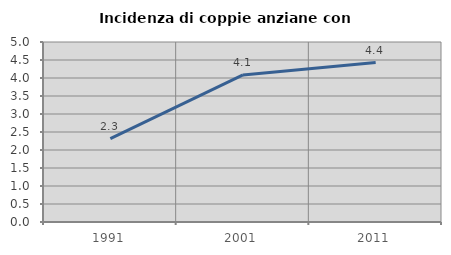
| Category | Incidenza di coppie anziane con figli |
|---|---|
| 1991.0 | 2.314 |
| 2001.0 | 4.086 |
| 2011.0 | 4.427 |